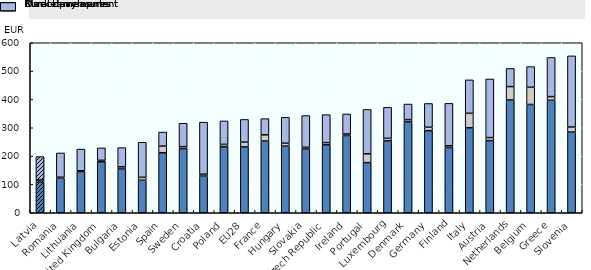
| Category | Direct payments | Market measures | Rural development |
|---|---|---|---|
| Latvia | 108.113 | 7.691 | 82.311 |
| Romania | 122.197 | 3.101 | 85.761 |
| Lithuania | 145.436 | 2.663 | 76.665 |
| United Kingdom | 179.737 | 5.274 | 44.006 |
| Bulgaria | 154.461 | 7.483 | 67.926 |
| Estonia | 114.646 | 10.427 | 123.656 |
| Spain | 211.904 | 23.26 | 49.611 |
| Sweden | 226.437 | 7.07 | 82.35 |
| Croatia | 129.352 | 6.753 | 183.622 |
| Poland | 233.004 | 8.261 | 82.79 |
| EU28 | 232.416 | 16.787 | 80.194 |
| France | 252.974 | 21.984 | 57.213 |
| Hungary | 235.219 | 10.26 | 91.392 |
| Slovakia | 224.847 | 6.108 | 112.074 |
| Czech Republic | 239.73 | 7.937 | 98.608 |
| Ireland | 272.774 | 5.169 | 70.663 |
| Portugal | 177 | 30.867 | 156.705 |
| Luxembourg | 253.547 | 9.134 | 109.347 |
| Denmark | 320.662 | 8.05 | 55.021 |
| Germany | 289.681 | 12.046 | 83.922 |
| Finland | 230.228 | 6.339 | 149.566 |
| Italy | 299.74 | 51.284 | 117.952 |
| Austria | 254.604 | 10.721 | 206.759 |
| Netherlands | 398.068 | 47.196 | 64.124 |
| Belgium | 382.126 | 60.712 | 73.016 |
| Greece | 396.992 | 12.92 | 138.154 |
| Slovenia | 284.719 | 17.995 | 250.984 |